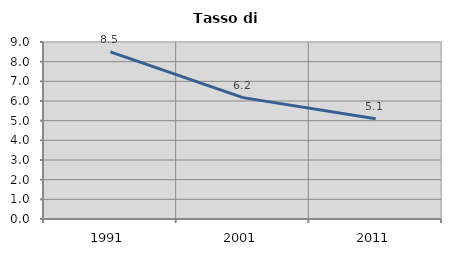
| Category | Tasso di disoccupazione   |
|---|---|
| 1991.0 | 8.495 |
| 2001.0 | 6.172 |
| 2011.0 | 5.094 |